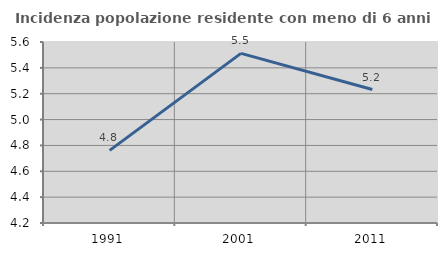
| Category | Incidenza popolazione residente con meno di 6 anni |
|---|---|
| 1991.0 | 4.762 |
| 2001.0 | 5.512 |
| 2011.0 | 5.233 |